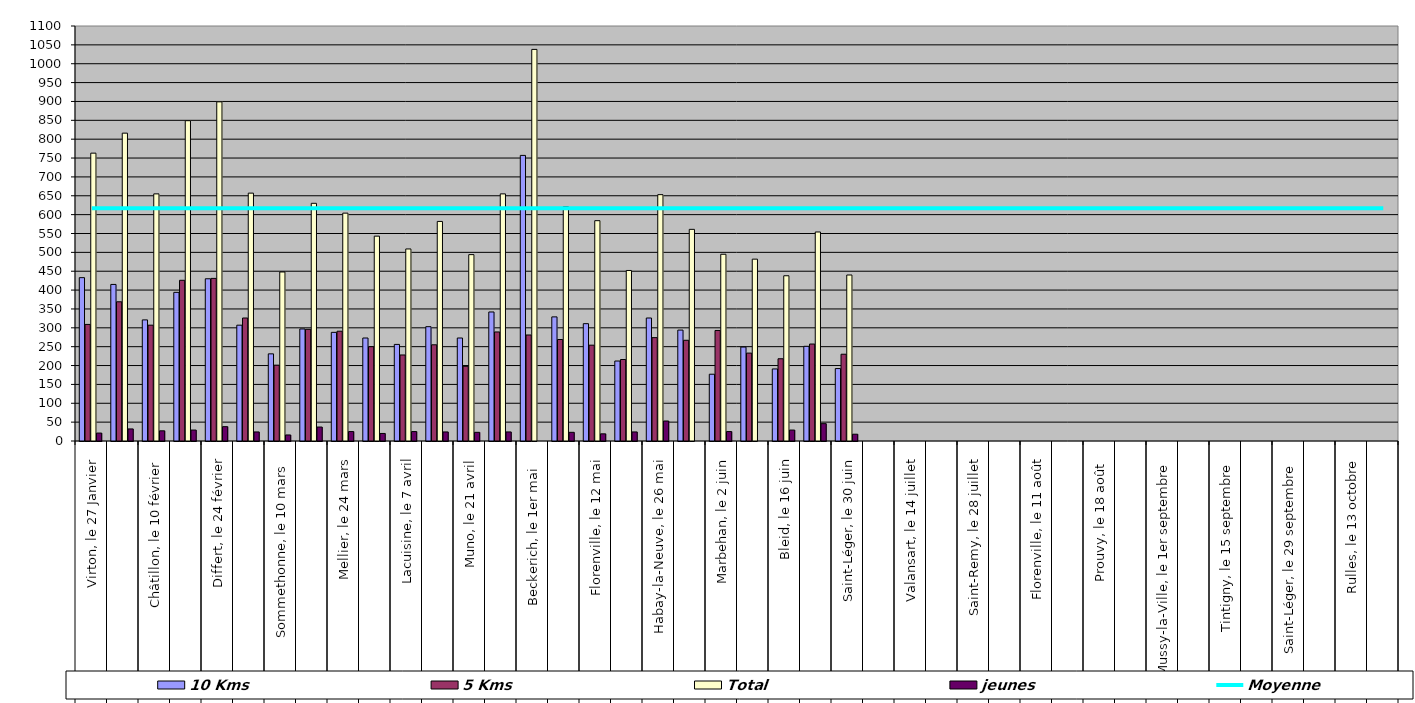
| Category | 10 Kms | 5 Kms | Total | jeunes |
|---|---|---|---|---|
| 0 | 433 | 309 | 763 | 21 |
| 1 | 415 | 369 | 816 | 32 |
| 2 | 321 | 307 | 655 | 27 |
| 3 | 394 | 426 | 849 | 29 |
| 4 | 430 | 431 | 899 | 38 |
| 5 | 307 | 326 | 657 | 24 |
| 6 | 231 | 201 | 448 | 16 |
| 7 | 297 | 296 | 630 | 37 |
| 8 | 288 | 291 | 604 | 25 |
| 9 | 273 | 250 | 543 | 20 |
| 10 | 256 | 228 | 509 | 25 |
| 11 | 303 | 255 | 582 | 24 |
| 12 | 273 | 198 | 494 | 23 |
| 13 | 342 | 289 | 655 | 24 |
| 14 | 757 | 281 | 1038 | 0 |
| 15 | 329 | 269 | 621 | 23 |
| 16 | 311 | 254 | 584 | 19 |
| 17 | 212 | 216 | 452 | 24 |
| 18 | 326 | 274 | 653 | 53 |
| 19 | 294 | 267 | 561 | 0 |
| 20 | 177 | 293 | 495 | 25 |
| 21 | 249 | 233 | 482 | 0 |
| 22 | 191 | 218 | 438 | 29 |
| 23 | 251 | 257 | 554 | 46 |
| 24 | 192 | 230 | 440 | 18 |
| 25 | 0 | 0 | 0 | 0 |
| 26 | 0 | 0 | 0 | 0 |
| 27 | 0 | 0 | 0 | 0 |
| 28 | 0 | 0 | 0 | 0 |
| 29 | 0 | 0 | 0 | 0 |
| 30 | 0 | 0 | 0 | 0 |
| 31 | 0 | 0 | 0 | 0 |
| 32 | 0 | 0 | 0 | 0 |
| 33 | 0 | 0 | 0 | 0 |
| 34 | 0 | 0 | 0 | 0 |
| 35 | 0 | 0 | 0 | 0 |
| 36 | 0 | 0 | 0 | 0 |
| 37 | 0 | 0 | 0 | 0 |
| 38 | 0 | 0 | 0 | 0 |
| 39 | 0 | 0 | 0 | 0 |
| 40 | 0 | 0 | 0 | 0 |
| 41 | 0 | 0 | 0 | 0 |